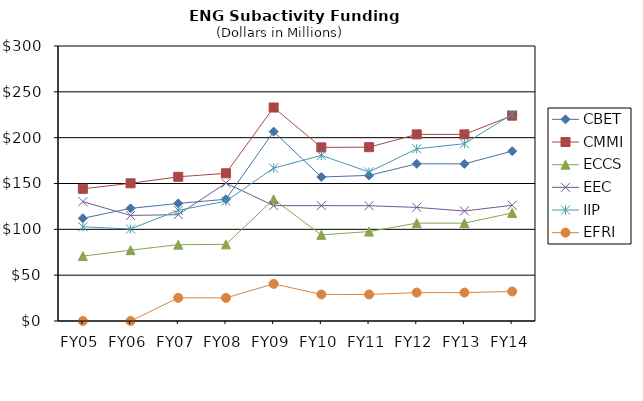
| Category | CBET | CMMI | ECCS | EEC | IIP | EFRI |
|---|---|---|---|---|---|---|
| FY05 | 112.06 | 144.23 | 70.79 | 130.23 | 102.75 | 0 |
| FY06 | 122.87 | 150.19 | 77.27 | 115.16 | 100.36 | 0 |
| FY07 | 128.27 | 157.3 | 83.24 | 116.02 | 120.78 | 25.25 |
| FY08 | 132.81 | 161.11 | 83.6 | 150.41 | 130.72 | 25.23 |
| FY09 | 206.57 | 232.89 | 132.78 | 125.86 | 166.82 | 40.5 |
| FY10 | 157.08 | 189.4 | 93.97 | 125.86 | 180.63 | 28.99 |
| FY11 | 158.82 | 189.62 | 97.54 | 125.76 | 162.65 | 28.95 |
| FY12 | 171.51 | 203.59 | 106.74 | 123.93 | 187.79 | 30.99 |
| FY13 | 171.45 | 203.58 | 106.73 | 120 | 193.41 | 31 |
| FY14 | 185.3 | 224.02 | 117.9 | 126.25 | 225.45 | 32.2 |